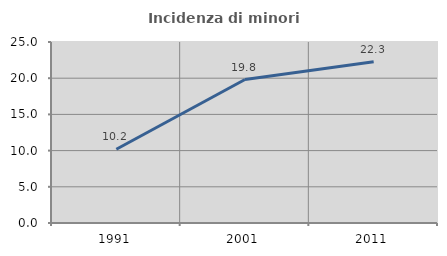
| Category | Incidenza di minori stranieri |
|---|---|
| 1991.0 | 10.185 |
| 2001.0 | 19.818 |
| 2011.0 | 22.274 |